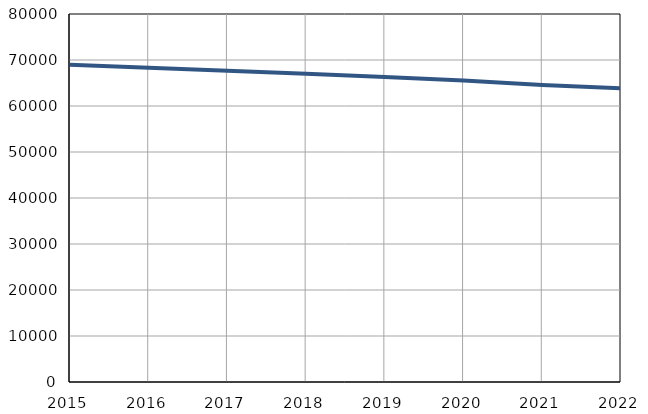
| Category | Population
size |
|---|---|
| 2015.0 | 68965 |
| 2016.0 | 68314 |
| 2017.0 | 67649 |
| 2018.0 | 66996 |
| 2019.0 | 66328 |
| 2020.0 | 65545 |
| 2021.0 | 64553 |
| 2022.0 | 63832 |